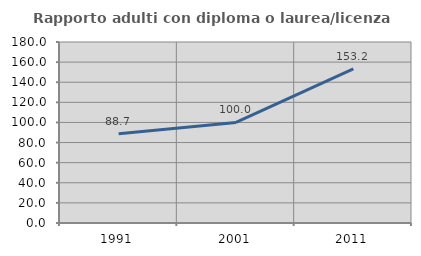
| Category | Rapporto adulti con diploma o laurea/licenza media  |
|---|---|
| 1991.0 | 88.71 |
| 2001.0 | 100 |
| 2011.0 | 153.191 |